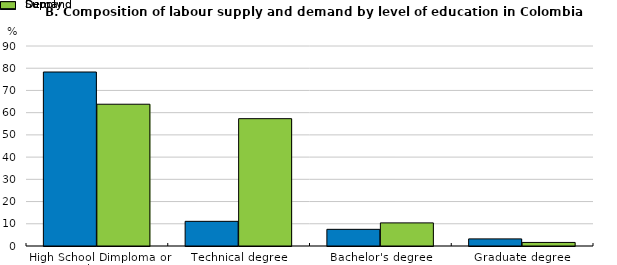
| Category | Supply  | Demand |
|---|---|---|
| High School Dimploma or less | 78.3 | 63.8 |
| Technical degree | 11.1 | 57.3 |
| Bachelor's degree | 7.5 | 10.4 |
| Graduate degree | 3.2 | 1.6 |